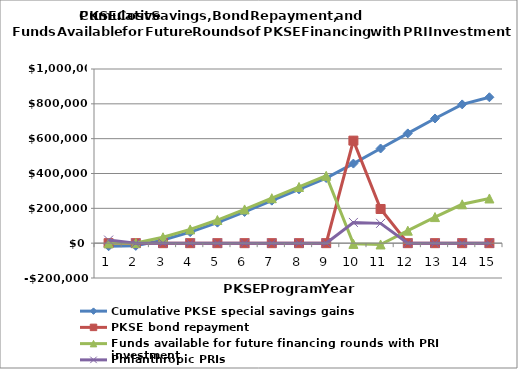
| Category | Cumulative PKSE special savings gains | PKSE bond repayment | Funds available for future financing rounds with PRI investment | Philanthropic PRIs |
|---|---|---|---|---|
| 0 | -17662.5 | 0 | -529.875 | 17662.5 |
| 1 | -15549.43 | 0 | 1053.32 | 0 |
| 2 | 17844.188 | 0 | 33917.063 | 0 |
| 3 | 63420.094 | 0 | 78963.094 | 0 |
| 4 | 117830.457 | 0 | 132843.582 | 0 |
| 5 | 179185.904 | 0 | 193669.154 | 0 |
| 6 | 244163.143 | 0 | 258116.518 | 0 |
| 7 | 309244.547 | 0 | 322668.047 | 0 |
| 8 | 373964.297 | 0 | 386857.922 | 0 |
| 9 | 456896.073 | 588750 | -4098.684 | 118960.302 |
| 10 | 543545.629 | 196250 | -7509.658 | 113699.127 |
| 11 | 630206.148 | 0 | 71641.203 | 0 |
| 12 | 715864.863 | 0 | 149790.26 | 0 |
| 13 | 796713.084 | 0 | 223128.823 | 0 |
| 14 | 837711.986 | 0 | 256618.068 | 0 |